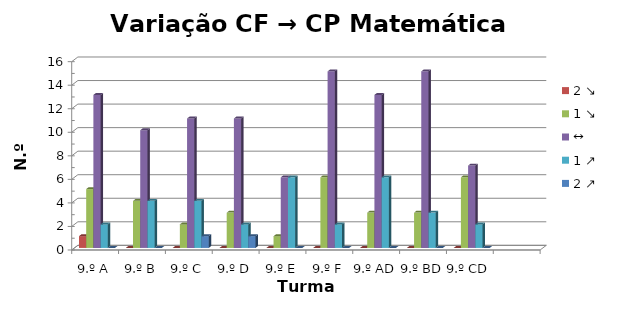
| Category | 2 ↘ | 1 ↘ | ↔ | 1 ↗ | 2 ↗ |
|---|---|---|---|---|---|
| 9.º A | 1 | 5 | 13 | 2 | 0 |
| 9.º B | 0 | 4 | 10 | 4 | 0 |
| 9.º C | 0 | 2 | 11 | 4 | 1 |
| 9.º D | 0 | 3 | 11 | 2 | 1 |
| 9.º E | 0 | 1 | 6 | 6 | 0 |
| 9.º F | 0 | 6 | 15 | 2 | 0 |
| 9.º AD | 0 | 3 | 13 | 6 | 0 |
| 9.º BD | 0 | 3 | 15 | 3 | 0 |
| 9.º CD | 0 | 6 | 7 | 2 | 0 |